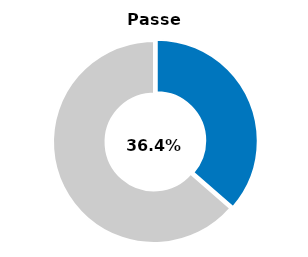
| Category | Series 0 |
|---|---|
| Passed | 0.364 |
| Other | 0.636 |